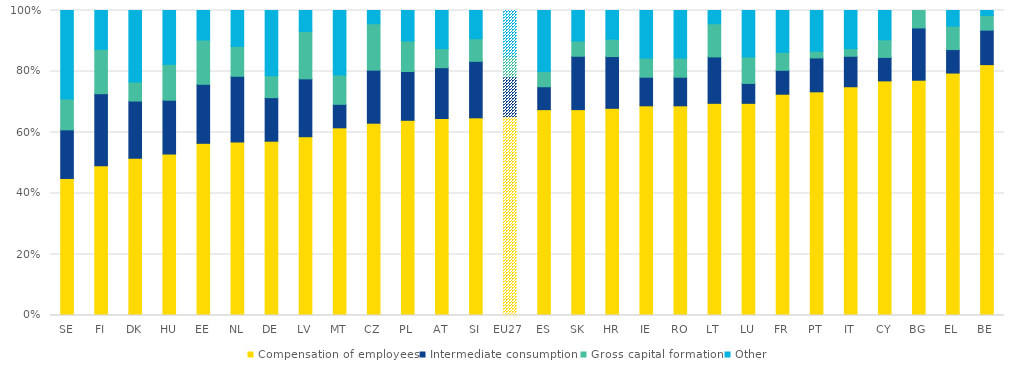
| Category | Compensation of employees | Intermediate consumption | Gross capital formation | Other |
|---|---|---|---|---|
| SE | 0.449 | 0.159 | 0.101 | 0.29 |
| FI | 0.491 | 0.236 | 0.145 | 0.127 |
| DK | 0.516 | 0.187 | 0.062 | 0.234 |
| HU | 0.529 | 0.176 | 0.118 | 0.176 |
| EE | 0.565 | 0.194 | 0.145 | 0.097 |
| NL | 0.569 | 0.216 | 0.098 | 0.118 |
| DE | 0.571 | 0.143 | 0.071 | 0.214 |
| LV | 0.586 | 0.19 | 0.155 | 0.069 |
| MT | 0.615 | 0.077 | 0.096 | 0.212 |
| CZ | 0.63 | 0.174 | 0.152 | 0.043 |
| PL | 0.64 | 0.16 | 0.1 | 0.1 |
| AT | 0.646 | 0.167 | 0.062 | 0.125 |
| SI | 0.648 | 0.185 | 0.074 | 0.093 |
| EU27 | 0.652 | 0.13 | 0.065 | 0.152 |
| ES | 0.675 | 0.075 | 0.05 | 0.2 |
| SK | 0.675 | 0.175 | 0.05 | 0.1 |
| HR | 0.679 | 0.17 | 0.057 | 0.094 |
| IE | 0.688 | 0.094 | 0.062 | 0.156 |
| RO | 0.688 | 0.094 | 0.062 | 0.156 |
| LT | 0.696 | 0.152 | 0.109 | 0.043 |
| LU | 0.696 | 0.065 | 0.087 | 0.152 |
| FR | 0.725 | 0.078 | 0.059 | 0.137 |
| PT | 0.733 | 0.111 | 0.022 | 0.133 |
| IT | 0.75 | 0.1 | 0.025 | 0.125 |
| CY | 0.769 | 0.077 | 0.058 | 0.096 |
| BG | 0.771 | 0.171 | 0.057 | 0 |
| EL | 0.795 | 0.077 | 0.077 | 0.051 |
| BE | 0.823 | 0.113 | 0.048 | 0.016 |